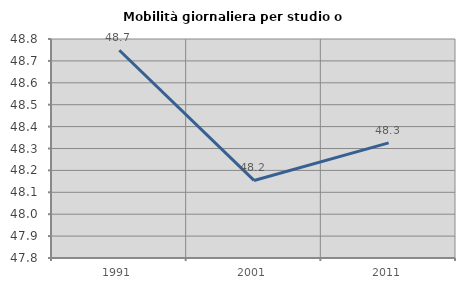
| Category | Mobilità giornaliera per studio o lavoro |
|---|---|
| 1991.0 | 48.749 |
| 2001.0 | 48.154 |
| 2011.0 | 48.326 |